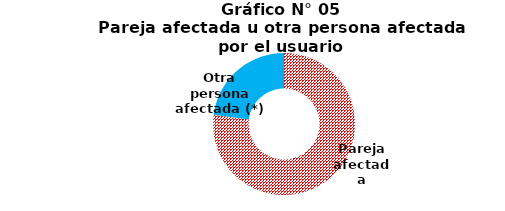
| Category | Series 0 |
|---|---|
| Pareja afectada | 1491 |
| Otra persona afectada (*) | 444 |